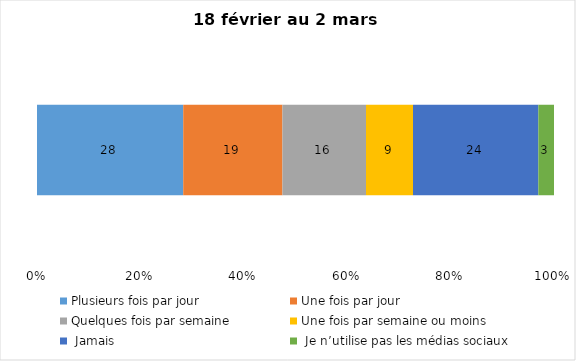
| Category | Plusieurs fois par jour | Une fois par jour | Quelques fois par semaine   | Une fois par semaine ou moins   |  Jamais   |  Je n’utilise pas les médias sociaux |
|---|---|---|---|---|---|---|
| 0 | 28 | 19 | 16 | 9 | 24 | 3 |